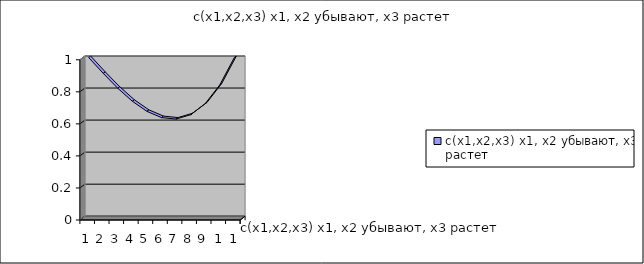
| Category | c(x1,x2,x3) x1, x2 убывают, x3 растет |
|---|---|
| 0 | 1 |
| 1 | 0.901 |
| 2 | 0.808 |
| 3 | 0.727 |
| 4 | 0.664 |
| 5 | 0.625 |
| 6 | 0.616 |
| 7 | 0.643 |
| 8 | 0.712 |
| 9 | 0.829 |
| 10 | 1 |